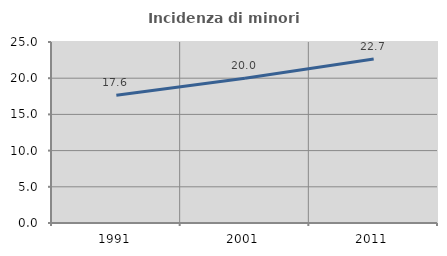
| Category | Incidenza di minori stranieri |
|---|---|
| 1991.0 | 17.647 |
| 2001.0 | 20 |
| 2011.0 | 22.656 |